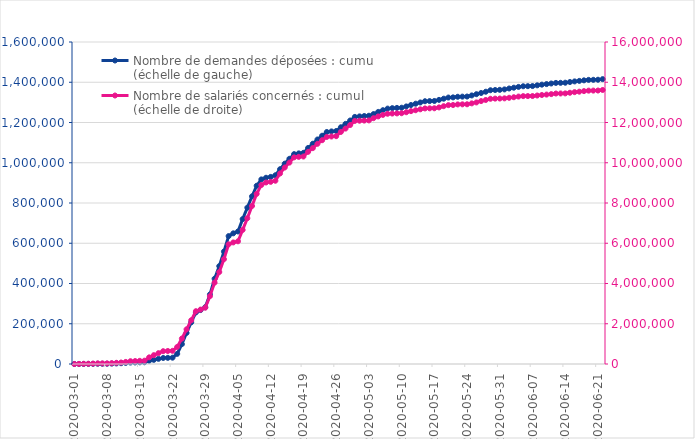
| Category | Nombre de demandes déposées : cumul (échelle de gauche) |
|---|---|
| 2020-03-01 | 1 |
| 2020-03-02 | 125 |
| 2020-03-03 | 290 |
| 2020-03-04 | 491 |
| 2020-03-05 | 795 |
| 2020-03-06 | 1272 |
| 2020-03-07 | 1297 |
| 2020-03-08 | 1314 |
| 2020-03-09 | 1944 |
| 2020-03-10 | 2795 |
| 2020-03-11 | 3907 |
| 2020-03-12 | 5457 |
| 2020-03-13 | 7230 |
| 2020-03-14 | 7696 |
| 2020-03-15 | 8346 |
| 2020-03-16 | 8671 |
| 2020-03-17 | 16146 |
| 2020-03-18 | 20687 |
| 2020-03-19 | 25716 |
| 2020-03-20 | 29952 |
| 2020-03-21 | 30601 |
| 2020-03-22 | 31415 |
| 2020-03-23 | 50390 |
| 2020-03-24 | 98539 |
| 2020-03-25 | 154362 |
| 2020-03-26 | 207110 |
| 2020-03-27 | 256467 |
| 2020-03-28 | 268080 |
| 2020-03-29 | 282237 |
| 2020-03-30 | 345407 |
| 2020-03-31 | 423951 |
| 2020-04-01 | 486354 |
| 2020-04-02 | 558785 |
| 2020-04-03 | 635597 |
| 2020-04-04 | 649274 |
| 2020-04-05 | 658466 |
| 2020-04-06 | 720068 |
| 2020-04-07 | 776888 |
| 2020-04-08 | 833129 |
| 2020-04-09 | 885819 |
| 2020-04-10 | 917267 |
| 2020-04-11 | 925462 |
| 2020-04-12 | 929644 |
| 2020-04-13 | 937846 |
| 2020-04-14 | 967910 |
| 2020-04-15 | 995352 |
| 2020-04-16 | 1019595 |
| 2020-04-17 | 1042894 |
| 2020-04-18 | 1046548 |
| 2020-04-19 | 1049275 |
| 2020-04-20 | 1073437 |
| 2020-04-21 | 1094449 |
| 2020-04-22 | 1115514 |
| 2020-04-23 | 1134244 |
| 2020-04-24 | 1152709 |
| 2020-04-25 | 1155686 |
| 2020-04-26 | 1157674 |
| 2020-04-27 | 1176249 |
| 2020-04-28 | 1193163 |
| 2020-04-29 | 1209930 |
| 2020-04-30 | 1227786 |
| 2020-05-01 | 1230398 |
| 2020-05-02 | 1232148 |
| 2020-05-03 | 1233548 |
| 2020-05-04 | 1242000 |
| 2020-05-05 | 1252673 |
| 2020-05-06 | 1261076 |
| 2020-05-07 | 1269047 |
| 2020-05-08 | 1271245 |
| 2020-05-09 | 1272549 |
| 2020-05-10 | 1273415 |
| 2020-05-11 | 1279831 |
| 2020-05-12 | 1286849 |
| 2020-05-13 | 1293468 |
| 2020-05-14 | 1299528 |
| 2020-05-15 | 1305631 |
| 2020-05-16 | 1306434 |
| 2020-05-17 | 1307009 |
| 2020-05-18 | 1312415 |
| 2020-05-19 | 1318306 |
| 2020-05-20 | 1324019 |
| 2020-05-21 | 1324882 |
| 2020-05-22 | 1327813 |
| 2020-05-23 | 1328502 |
| 2020-05-24 | 1329023 |
| 2020-05-25 | 1334495 |
| 2020-05-26 | 1340668 |
| 2020-05-27 | 1346632 |
| 2020-05-28 | 1352946 |
| 2020-05-29 | 1360292 |
| 2020-05-30 | 1361419 |
| 2020-05-31 | 1362368 |
| 2020-06-01 | 1364432 |
| 2020-06-02 | 1368981 |
| 2020-06-03 | 1372939 |
| 2020-06-04 | 1376831 |
| 2020-06-05 | 1380069 |
| 2020-06-06 | 1380598 |
| 2020-06-07 | 1381079 |
| 2020-06-08 | 1384731 |
| 2020-06-09 | 1388029 |
| 2020-06-10 | 1390859 |
| 2020-06-11 | 1393790 |
| 2020-06-12 | 1396698 |
| 2020-06-13 | 1397110 |
| 2020-06-14 | 1397738 |
| 2020-06-15 | 1401101 |
| 2020-06-16 | 1404184 |
| 2020-06-17 | 1406732 |
| 2020-06-18 | 1409451 |
| 2020-06-19 | 1411747 |
| 2020-06-20 | 1412076 |
| 2020-06-21 | 1412501 |
| 2020-06-22 | 1415500 |